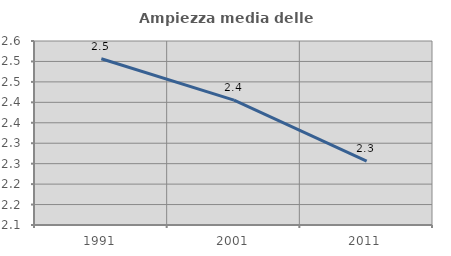
| Category | Ampiezza media delle famiglie |
|---|---|
| 1991.0 | 2.507 |
| 2001.0 | 2.405 |
| 2011.0 | 2.256 |